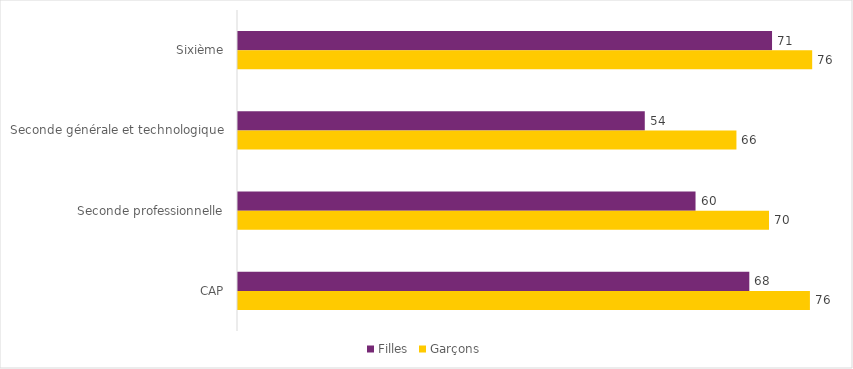
| Category | Filles | Garçons |
|---|---|---|
| Sixième | 70.5 | 75.8 |
| Seconde générale et technologique | 53.7 | 65.8 |
| Seconde professionnelle | 60.4 | 70.1 |
| CAP | 67.5 | 75.5 |